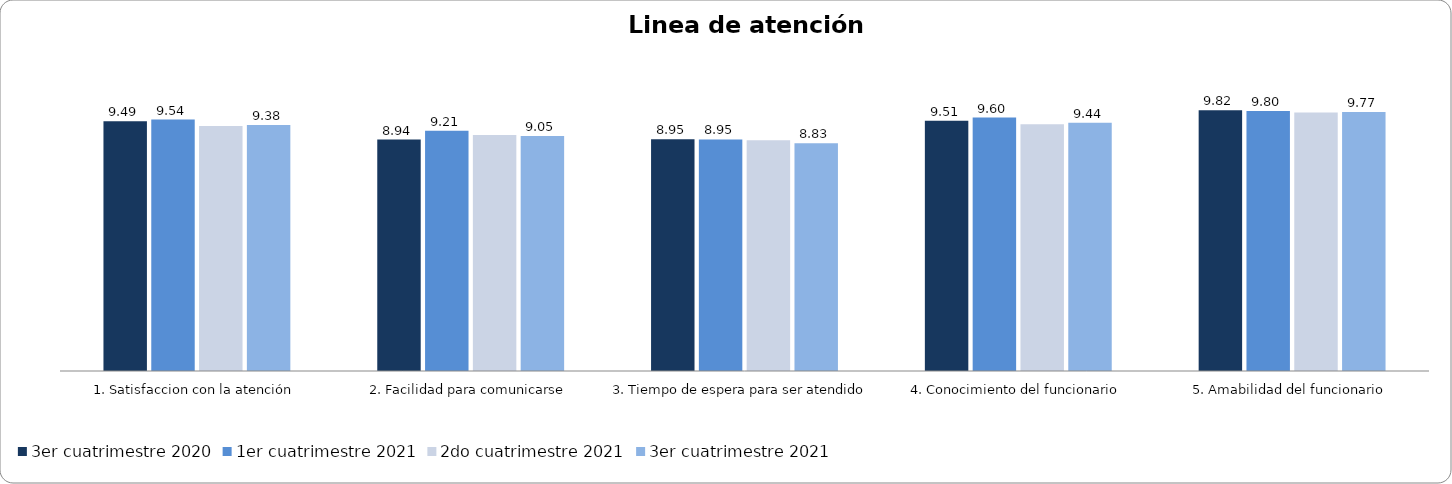
| Category | 3er cuatrimestre 2020 | 1er cuatrimestre 2021 | Septiembre - Octubre 2018 | Noviembre - Diciembre 2018 | 2do cuatrimestre 2021 | 1er cuatrimestre 2019 | 2do cuatrimestre 2019 | 3er cuatrimestre 2019 | 3er cuatrimestre 2021 |
|---|---|---|---|---|---|---|---|---|---|
| 1. Satisfaccion con la atención | 9.495 | 9.543 |  |  | 9.353 |  |  |  | 9.377 |
| 2. Facilidad para comunicarse | 8.944 | 9.206 |  |  | 9.078 |  |  |  | 9.053 |
| 3. Tiempo de espera para ser atendido | 8.955 | 8.947 |  |  | 8.92 |  |  |  | 8.833 |
| 4. Conocimiento del funcionario | 9.505 | 9.604 |  |  | 9.401 |  |  |  | 9.445 |
| 5. Amabilidad del funcionario | 9.824 | 9.797 |  |  | 9.757 |  |  |  | 9.772 |